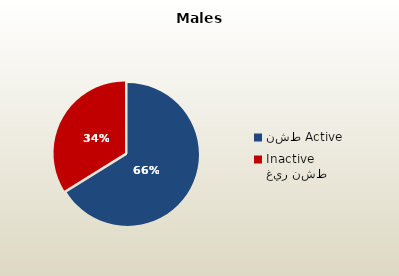
| Category | الذكور القطريين  Qatari Males |
|---|---|
| نشط Active | 70814 |
| غير نشط Inactive | 36206 |